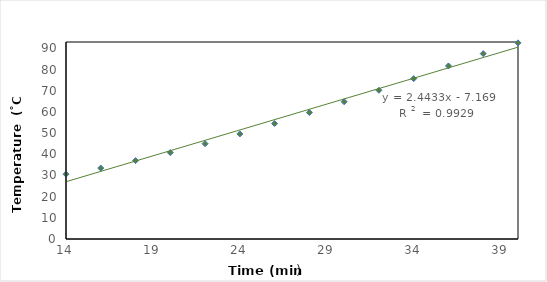
| Category | Series 0 |
|---|---|
| 14.0 | 30.6 |
| 16.0 | 33.5 |
| 18.0 | 37 |
| 20.0 | 40.8 |
| 22.0 | 45 |
| 24.0 | 49.6 |
| 26.0 | 54.5 |
| 28.0 | 59.7 |
| 30.0 | 64.8 |
| 32.0 | 70.2 |
| 34.0 | 75.7 |
| 36.0 | 81.7 |
| 38.0 | 87.5 |
| 40.0 | 92.6 |